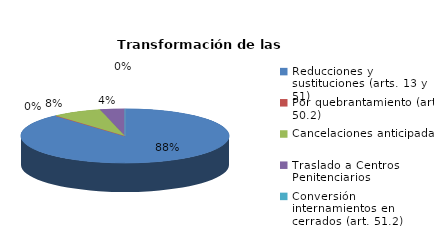
| Category | Series 0 |
|---|---|
| Reducciones y sustituciones (arts. 13 y 51) | 23 |
| Por quebrantamiento (art. 50.2) | 0 |
| Cancelaciones anticipadas | 2 |
| Traslado a Centros Penitenciarios | 1 |
| Conversión internamientos en cerrados (art. 51.2) | 0 |